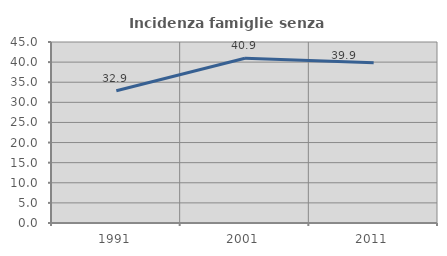
| Category | Incidenza famiglie senza nuclei |
|---|---|
| 1991.0 | 32.888 |
| 2001.0 | 40.941 |
| 2011.0 | 39.871 |